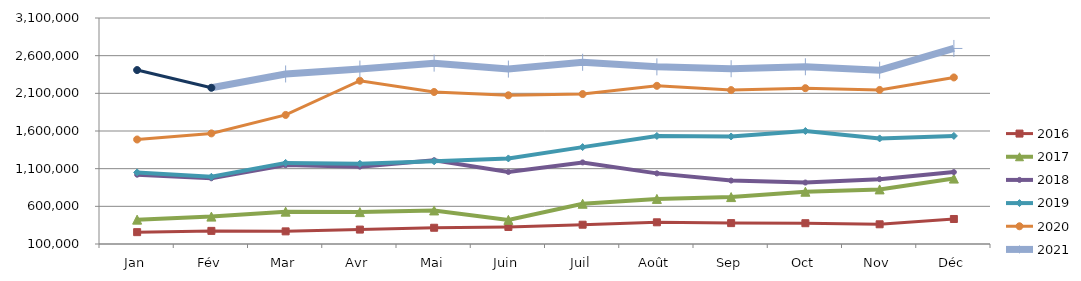
| Category | 2015 | 2016 | 2017 | 2018 | 2019 | 2020 | 2021 |
|---|---|---|---|---|---|---|---|
| Jan |  | 257238.227 | 423360.679 | 1019658.015 | 1050220.805 | 1487095.506 | 2408854.792 |
| Fév |  | 274182.928 | 463512.001 | 972274.256 | 992184.961 | 1568141.915 | 2173768.196 |
| Mar |  | 267739.55 | 529345.368 | 1147166.528 | 1176757.88 | 1813146.21 | 2357168.574 |
| Avr |  | 291238.37 | 523228.337 | 1126714.531 | 1164825.987 | 2267448.511 | 2422161.719 |
| Mai |  | 315573.949 | 545414.731 | 1212070.878 | 1197851.486 | 2117791.111 | 2500803.422 |
| Juin |  | 326203.362 | 420430.116 | 1056092.947 | 1235809.908 | 2073858.17 | 2421915.839 |
| Juil |  | 356111.54 | 634345.533 | 1183060.966 | 1386180.582 | 2090325.728 | 2512181.372 |
| Août |  | 388007.58 | 698691.374 | 1037606.311 | 1534426.4 | 2199836.197 | 2451614.864 |
| Sep |  | 377114.56 | 722782.357 | 941820.554 | 1527323.009 | 2142727.977 | 2426567.826 |
| Oct |  | 376009.188 | 793837.955 | 915772.772 | 1599889.902 | 2168338.194 | 2452518.375 |
| Nov |  | 361587.784 | 824574.744 | 960817.552 | 1501599.407 | 2145083.497 | 2407792.57 |
| Déc |  | 431907.412 | 968412.649 | 1054685.303 | 1534756.751 | 2310730.947 | 2695648.711 |